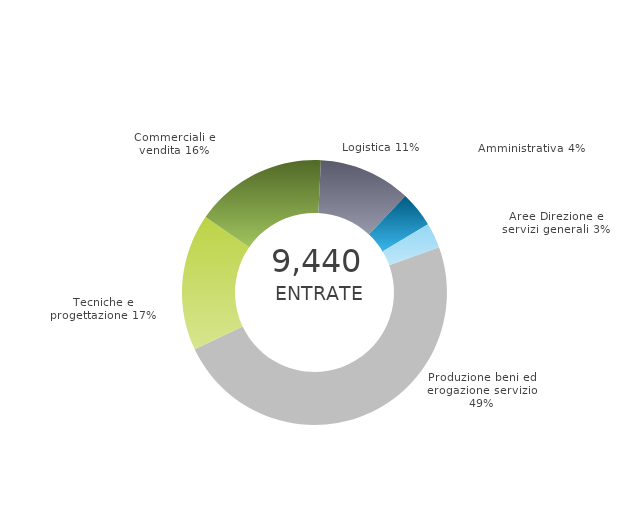
| Category | Series 0 | Series 1 |
|---|---|---|
| Produzione beni ed erogazione servizio | 0 | 0.485 |
| Tecniche e progettazione | 0 | 0.167 |
| Commerciali e vendita | 0 | 0.161 |
| Logistica | 0 | 0.112 |
| Amministrativa | 0 | 0.044 |
| Aree Direzione e servizi generali | 0 | 0.031 |